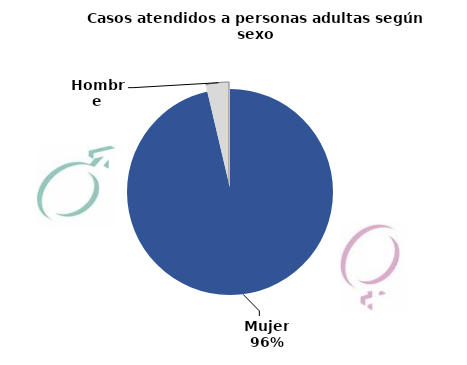
| Category | Series 0 |
|---|---|
| Mujer | 68281 |
| Hombre | 2607 |